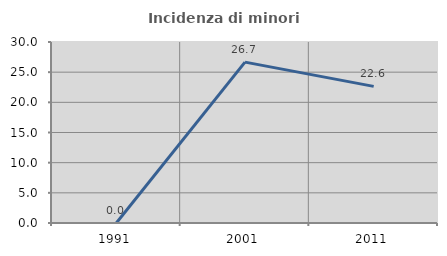
| Category | Incidenza di minori stranieri |
|---|---|
| 1991.0 | 0 |
| 2001.0 | 26.667 |
| 2011.0 | 22.642 |